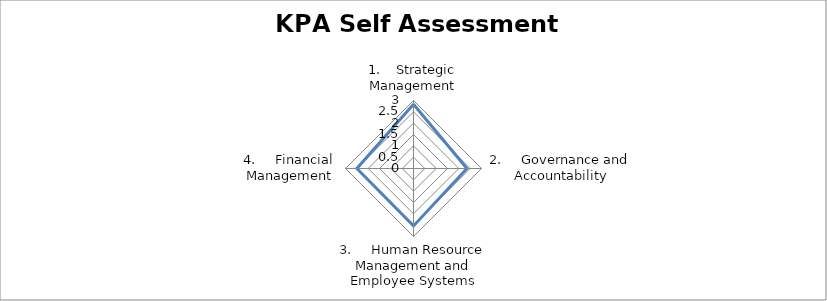
| Category |  Self assess  |
|---|---|
| 1.    Strategic Management | 2.833 |
| 2.     Governance and Accountability | 2.357 |
| 3.     Human Resource Management and Employee Systems | 2.533 |
| 4.     Financial Management | 2.5 |